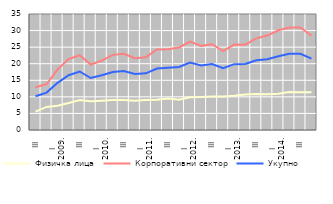
| Category | Физичка лица | Корпоративни сектор | Укупно |
|---|---|---|---|
| III | 5.567 | 12.901 | 10.175 |
| IV | 6.968 | 13.805 | 11.277 |
| I
2009. | 7.328 | 18.257 | 14.223 |
| II | 8.127 | 21.38 | 16.536 |
| III | 9.054 | 22.567 | 17.659 |
| IV | 8.661 | 19.747 | 15.687 |
| I
2010. | 8.856 | 20.927 | 16.514 |
| II | 9.029 | 22.669 | 17.515 |
| III | 9.074 | 23.005 | 17.823 |
| IV | 8.816 | 21.665 | 16.915 |
| I
2011. | 9.059 | 21.979 | 17.104 |
| II | 9.162 | 24.281 | 18.557 |
| III | 9.472 | 24.388 | 18.761 |
| IV | 9.109 | 24.895 | 19.034 |
| I
2012. | 9.894 | 26.649 | 20.362 |
| II | 9.939 | 25.388 | 19.501 |
| III | 10.111 | 25.887 | 19.906 |
| IV | 10.086 | 23.829 | 18.625 |
| I
2013. | 10.31 | 25.785 | 19.876 |
| II | 10.731 | 25.752 | 19.929 |
| III | 10.838 | 27.655 | 21.063 |
| IV | 10.802 | 28.484 | 21.366 |
| I
2014. | 10.952 | 30.084 | 22.249 |
| II | 11.471 | 30.895 | 23.009 |
| III | 11.404 | 30.914 | 23.01 |
| IV | 11.384 | 28.441 | 21.538 |